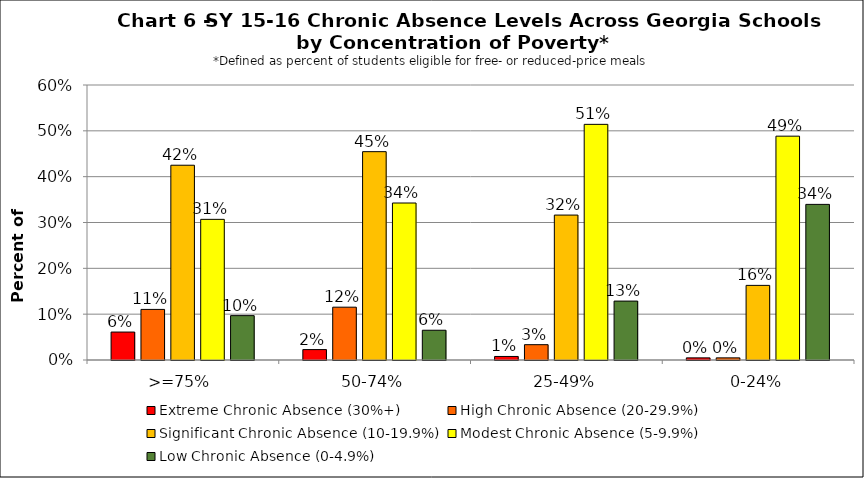
| Category | Extreme Chronic Absence (30%+) | High Chronic Absence (20-29.9%) | Significant Chronic Absence (10-19.9%) | Modest Chronic Absence (5-9.9%) | Low Chronic Absence (0-4.9%) |
|---|---|---|---|---|---|
| 0 | 0.061 | 0.11 | 0.425 | 0.307 | 0.097 |
| 1 | 0.023 | 0.115 | 0.455 | 0.343 | 0.065 |
| 2 | 0.008 | 0.033 | 0.316 | 0.514 | 0.129 |
| 3 | 0.005 | 0.005 | 0.163 | 0.488 | 0.34 |